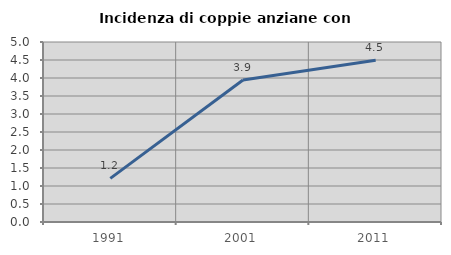
| Category | Incidenza di coppie anziane con figli |
|---|---|
| 1991.0 | 1.212 |
| 2001.0 | 3.944 |
| 2011.0 | 4.492 |